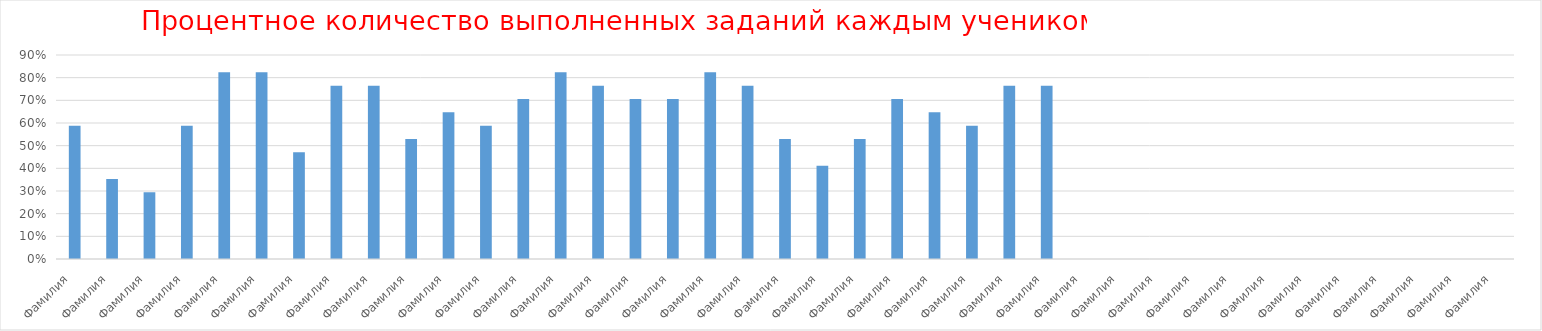
| Category | Series 0 |
|---|---|
| Фамилия  | 0.588 |
| Фамилия  | 0.353 |
| Фамилия  | 0.294 |
| Фамилия  | 0.588 |
| Фамилия  | 0.824 |
| Фамилия  | 0.824 |
| Фамилия  | 0.471 |
| Фамилия  | 0.765 |
| Фамилия  | 0.765 |
| Фамилия  | 0.529 |
| Фамилия  | 0.647 |
| Фамилия  | 0.588 |
| Фамилия  | 0.706 |
| Фамилия  | 0.824 |
| Фамилия  | 0.765 |
| Фамилия  | 0.706 |
| Фамилия  | 0.706 |
| Фамилия  | 0.824 |
| Фамилия  | 0.765 |
| Фамилия  | 0.529 |
| Фамилия  | 0.412 |
| Фамилия  | 0.529 |
| Фамилия  | 0.706 |
| Фамилия  | 0.647 |
| Фамилия  | 0.588 |
| Фамилия  | 0.765 |
| Фамилия  | 0.765 |
| Фамилия  | 0 |
| Фамилия  | 0 |
| Фамилия  | 0 |
| Фамилия  | 0 |
| Фамилия  | 0 |
| Фамилия  | 0 |
| Фамилия  | 0 |
| Фамилия  | 0 |
| Фамилия  | 0 |
| Фамилия  | 0 |
| Фамилия  | 0 |
| Фамилия  | 0 |